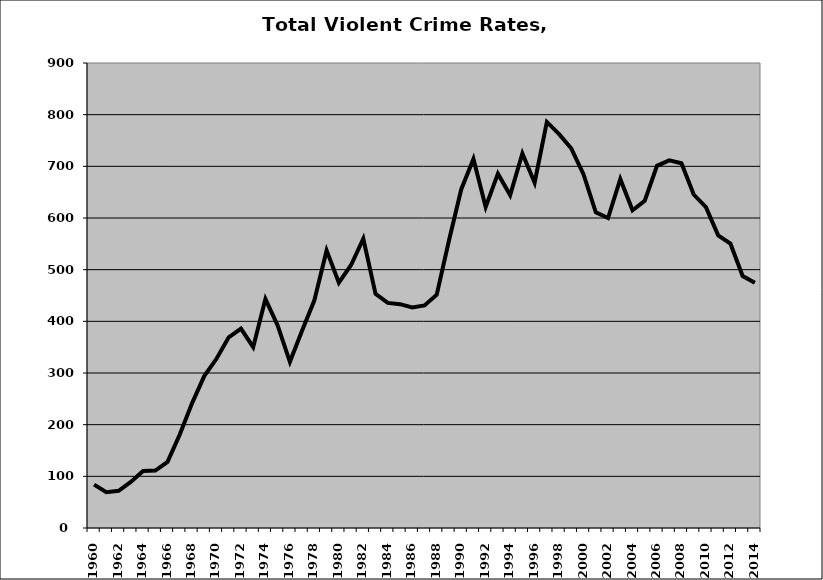
| Category | VCR |
|---|---|
| 1960.0 | 84.026 |
| 1961.0 | 69.432 |
| 1962.0 | 72.068 |
| 1963.0 | 89.076 |
| 1964.0 | 110.183 |
| 1965.0 | 111.089 |
| 1966.0 | 127.93 |
| 1967.0 | 180.916 |
| 1968.0 | 241.199 |
| 1969.0 | 294.074 |
| 1970.0 | 327.493 |
| 1971.0 | 369.176 |
| 1972.0 | 386.018 |
| 1973.0 | 350 |
| 1974.0 | 443.106 |
| 1975.0 | 392.055 |
| 1976.0 | 321.649 |
| 1977.0 | 382.131 |
| 1978.0 | 440.652 |
| 1979.0 | 537.285 |
| 1980.0 | 474.798 |
| 1981.0 | 509.03 |
| 1982.0 | 559.801 |
| 1983.0 | 453.135 |
| 1984.0 | 435.726 |
| 1985.0 | 433.28 |
| 1986.0 | 427.014 |
| 1987.0 | 430.745 |
| 1988.0 | 451.667 |
| 1989.0 | 556.464 |
| 1990.0 | 655.24 |
| 1991.0 | 714.265 |
| 1992.0 | 621.19 |
| 1993.0 | 685.857 |
| 1994.0 | 644.334 |
| 1995.0 | 724.965 |
| 1996.0 | 668.276 |
| 1997.0 | 785.929 |
| 1998.0 | 762.366 |
| 1999.0 | 734.402 |
| 2000.0 | 684.405 |
| 2001.0 | 611.098 |
| 2002.0 | 600.041 |
| 2003.0 | 675.291 |
| 2004.0 | 615.009 |
| 2005.0 | 633.449 |
| 2006.0 | 701.016 |
| 2007.0 | 711.524 |
| 2008.0 | 706.108 |
| 2009.0 | 645.448 |
| 2010.0 | 620.87 |
| 2011.0 | 566.434 |
| 2012.0 | 550.459 |
| 2013.0 | 487.657 |
| 2014.0 | 474.448 |